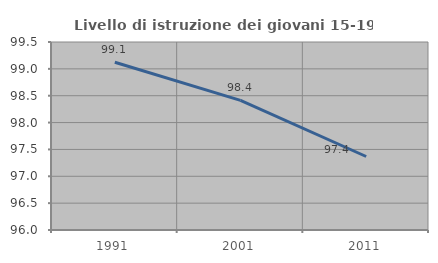
| Category | Livello di istruzione dei giovani 15-19 anni |
|---|---|
| 1991.0 | 99.123 |
| 2001.0 | 98.413 |
| 2011.0 | 97.368 |